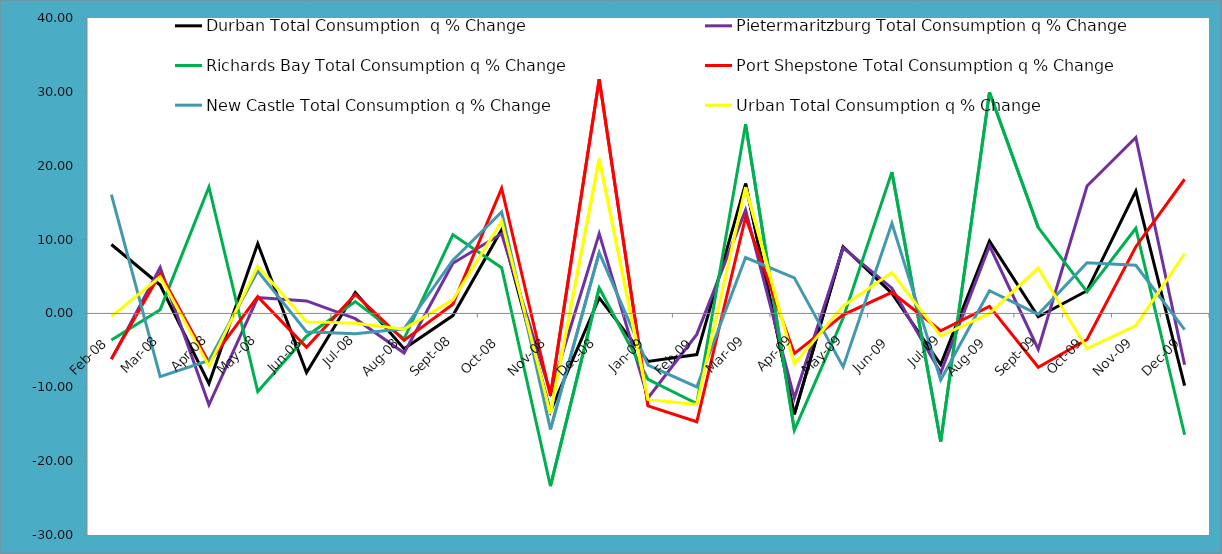
| Category | Durban Total Consumption  q % Change | Pietermaritzburg Total Consumption q % Change | Richards Bay Total Consumption q % Change | Port Shepstone Total Consumption q % Change | New Castle Total Consumption q % Change | Urban Total Consumption q % Change |
|---|---|---|---|---|---|---|
| 2008-02-01 | 9.331 | -6.217 | -3.605 | -6.125 | 16.084 | -0.398 |
| 2008-03-01 | 3.842 | 6.232 | 0.512 | 5.385 | -8.559 | 4.965 |
| 2008-04-01 | -9.497 | -12.371 | 17.12 | -6.629 | -6.371 | -7.13 |
| 2008-05-01 | 9.46 | 2.142 | -10.569 | 2.28 | 5.725 | 6.386 |
| 2008-06-01 | -7.999 | 1.697 | -3.088 | -4.573 | -2.469 | -1.111 |
| 2008-07-01 | 2.837 | -0.712 | 1.611 | 2.572 | -2.742 | -1.336 |
| 2008-08-01 | -4.781 | -5.349 | -3.434 | -3.643 | -2.08 | -2.128 |
| 2008-09-01 | -0.295 | 6.791 | 10.642 | 1.25 | 7.215 | 1.847 |
| 2008-10-01 | 11.331 | 10.793 | 6.191 | 16.931 | 13.735 | 12.478 |
| 2008-11-01 | -13.258 | -10.746 | -23.38 | -11.148 | -15.703 | -13.571 |
| 2008-12-01 | 2.1 | 10.802 | 3.447 | 31.694 | 8.242 | 20.934 |
| 2009-01-01 | -6.51 | -11.452 | -8.916 | -12.514 | -7.003 | -11.636 |
| 2009-02-01 | -5.569 | -2.841 | -12.197 | -14.668 | -9.954 | -12.338 |
| 2009-03-01 | 17.586 | 13.98 | 25.614 | 13.034 | 7.566 | 17.099 |
| 2009-04-01 | -13.669 | -11.462 | -15.799 | -5.442 | 4.816 | -6.828 |
| 2009-05-01 | 9.025 | 8.892 | -0.615 | -0.186 | -7.236 | 0.989 |
| 2009-06-01 | 2.727 | 3.42 | 19.14 | 2.856 | 12.205 | 5.543 |
| 2009-07-01 | -6.926 | -8.039 | -17.358 | -2.341 | -9.005 | -3.056 |
| 2009-08-01 | 9.789 | 9.144 | 29.934 | 0.963 | 3.079 | 0 |
| 2009-09-01 | -0.449 | -4.844 | 11.641 | -7.28 | -0.126 | 6.129 |
| 2009-10-01 | 3.071 | 17.256 | 2.928 | -3.533 | 6.862 | -4.77 |
| 2009-11-01 | 16.552 | 23.836 | 11.532 | 9.034 | 6.513 | -1.657 |
| 2009-12-01 | -9.765 | -6.943 | -16.423 | 18.167 | -2.198 | 8.085 |